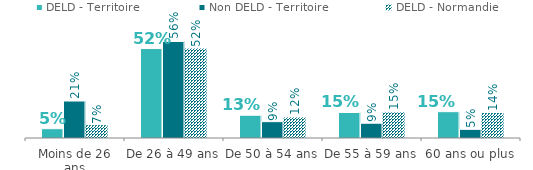
| Category | DELD - Territoire | Non DELD - Territoire | DELD - Normandie |
|---|---|---|---|
| Moins de 26 ans | 0.054 | 0.213 | 0.074 |
| De 26 à 49 ans | 0.516 | 0.557 | 0.516 |
| De 50 à 54 ans | 0.131 | 0.094 | 0.119 |
| De 55 à 59 ans | 0.147 | 0.085 | 0.148 |
| 60 ans ou plus | 0.152 | 0.05 | 0.144 |